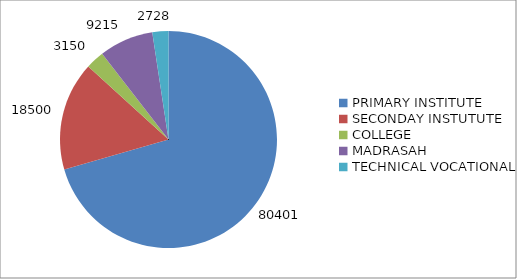
| Category | Series 0 |
|---|---|
| PRIMARY INSTITUTE  | 80401 |
| SECONDAY INSTUTUTE | 18500 |
| COLLEGE | 3150 |
| MADRASAH | 9215 |
| TECHNICAL VOCATIONAL | 2728 |